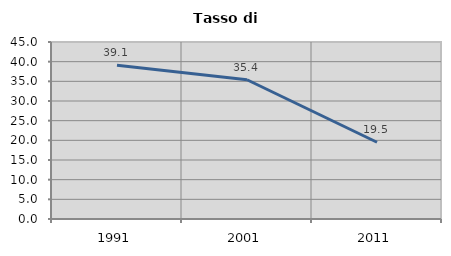
| Category | Tasso di disoccupazione   |
|---|---|
| 1991.0 | 39.114 |
| 2001.0 | 35.402 |
| 2011.0 | 19.512 |